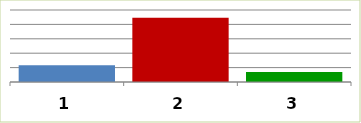
| Category | Series 0 |
|---|---|
| 0 | 5816642.59 |
| 1 | 22328767 |
| 2 | 3500000 |